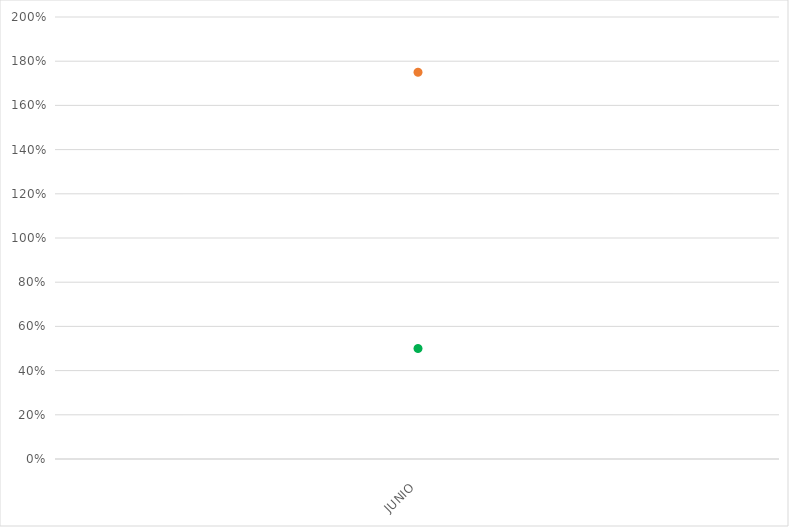
| Category | VALOR  | META PONDERADA |
|---|---|---|
| JUNIO | 1.75 | 0.5 |